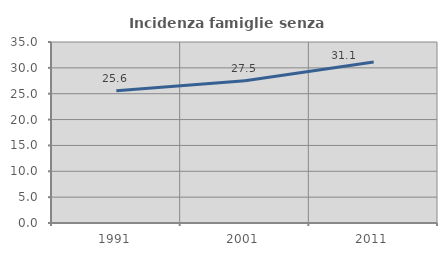
| Category | Incidenza famiglie senza nuclei |
|---|---|
| 1991.0 | 25.574 |
| 2001.0 | 27.505 |
| 2011.0 | 31.126 |